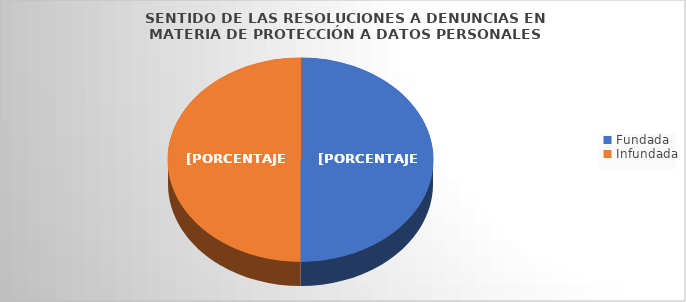
| Category | Series 0 |
|---|---|
| Fundada  | 1 |
| Infundada | 1 |